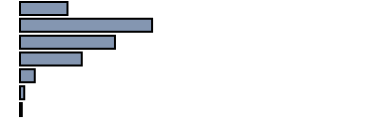
| Category | Series 0 |
|---|---|
| 0 | 13.3 |
| 1 | 37 |
| 2 | 26.6 |
| 3 | 17.3 |
| 4 | 4.1 |
| 5 | 1.2 |
| 6 | 0.5 |